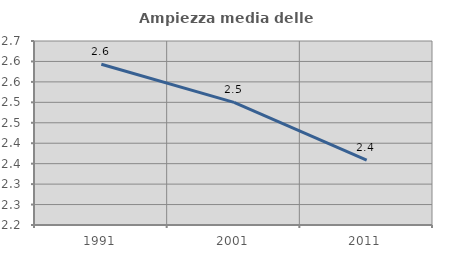
| Category | Ampiezza media delle famiglie |
|---|---|
| 1991.0 | 2.593 |
| 2001.0 | 2.5 |
| 2011.0 | 2.358 |